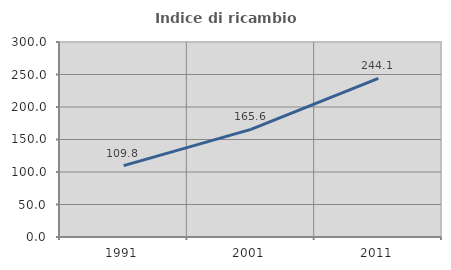
| Category | Indice di ricambio occupazionale  |
|---|---|
| 1991.0 | 109.778 |
| 2001.0 | 165.556 |
| 2011.0 | 244.144 |